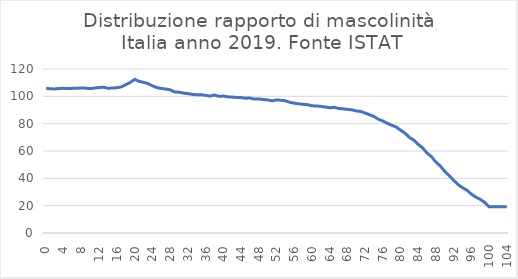
| Category | Series 0 |
|---|---|
| 0.0 | 105.905 |
| 1.0 | 105.473 |
| 2.0 | 105.436 |
| 3.0 | 105.78 |
| 4.0 | 105.861 |
| 5.0 | 105.644 |
| 6.0 | 105.844 |
| 7.0 | 105.928 |
| 8.0 | 106.165 |
| 9.0 | 105.961 |
| 10.0 | 105.614 |
| 11.0 | 106.133 |
| 12.0 | 106.455 |
| 13.0 | 106.638 |
| 14.0 | 105.912 |
| 15.0 | 106.095 |
| 16.0 | 106.3 |
| 17.0 | 106.921 |
| 18.0 | 108.617 |
| 19.0 | 110.243 |
| 20.0 | 112.396 |
| 21.0 | 110.942 |
| 22.0 | 110.26 |
| 23.0 | 109.298 |
| 24.0 | 107.711 |
| 25.0 | 106.387 |
| 26.0 | 105.782 |
| 27.0 | 105.312 |
| 28.0 | 104.813 |
| 29.0 | 103.166 |
| 30.0 | 103.03 |
| 31.0 | 102.368 |
| 32.0 | 102.011 |
| 33.0 | 101.412 |
| 34.0 | 101.147 |
| 35.0 | 101.18 |
| 36.0 | 100.728 |
| 37.0 | 100.159 |
| 38.0 | 100.965 |
| 39.0 | 100.006 |
| 40.0 | 100.202 |
| 41.0 | 99.636 |
| 42.0 | 99.447 |
| 43.0 | 99.185 |
| 44.0 | 99.06 |
| 45.0 | 98.65 |
| 46.0 | 98.768 |
| 47.0 | 97.959 |
| 48.0 | 98.022 |
| 49.0 | 97.662 |
| 50.0 | 97.381 |
| 51.0 | 96.712 |
| 52.0 | 97.404 |
| 53.0 | 97.111 |
| 54.0 | 96.724 |
| 55.0 | 95.599 |
| 56.0 | 95.002 |
| 57.0 | 94.47 |
| 58.0 | 94.151 |
| 59.0 | 93.897 |
| 60.0 | 93.059 |
| 61.0 | 92.962 |
| 62.0 | 92.659 |
| 63.0 | 92.263 |
| 64.0 | 91.61 |
| 65.0 | 92 |
| 66.0 | 91.171 |
| 67.0 | 90.865 |
| 68.0 | 90.484 |
| 69.0 | 90.166 |
| 70.0 | 89.345 |
| 71.0 | 88.94 |
| 72.0 | 87.783 |
| 73.0 | 86.556 |
| 74.0 | 85.276 |
| 75.0 | 83.238 |
| 76.0 | 81.955 |
| 77.0 | 80.306 |
| 78.0 | 78.779 |
| 79.0 | 77.638 |
| 80.0 | 75.25 |
| 81.0 | 73.094 |
| 82.0 | 69.968 |
| 83.0 | 67.945 |
| 84.0 | 64.873 |
| 85.0 | 62.224 |
| 86.0 | 58.505 |
| 87.0 | 55.832 |
| 88.0 | 51.907 |
| 89.0 | 48.965 |
| 90.0 | 45.115 |
| 91.0 | 41.93 |
| 92.0 | 38.559 |
| 93.0 | 35.415 |
| 94.0 | 33.139 |
| 95.0 | 31.287 |
| 96.0 | 28.458 |
| 97.0 | 26.305 |
| 98.0 | 24.607 |
| 99.0 | 22.428 |
| 100.0 | 19.156 |
| 101.0 | 19.156 |
| 102.0 | 19.156 |
| 103.0 | 19.156 |
| 104.0 | 19.156 |